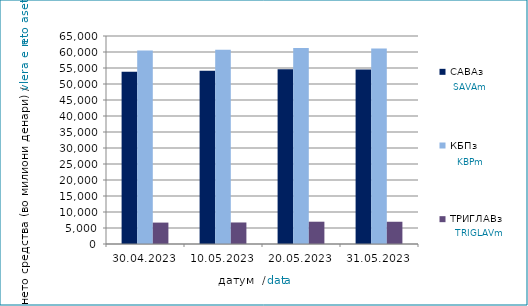
| Category | САВАз | КБПз | ТРИГЛАВз |
|---|---|---|---|
| 2023-04-30 | 53796.044 | 60437.308 | 6690.971 |
| 2023-05-10 | 54102.341 | 60695.752 | 6727.34 |
| 2023-05-20 | 54570.69 | 61233.784 | 6966.474 |
| 2023-05-31 | 54566.227 | 61089.579 | 6952.757 |